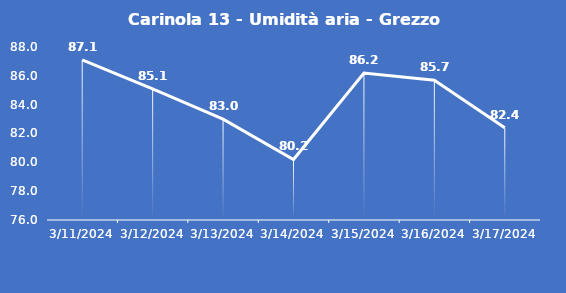
| Category | Carinola 13 - Umidità aria - Grezzo (%) |
|---|---|
| 3/11/24 | 87.1 |
| 3/12/24 | 85.1 |
| 3/13/24 | 83 |
| 3/14/24 | 80.2 |
| 3/15/24 | 86.2 |
| 3/16/24 | 85.7 |
| 3/17/24 | 82.4 |